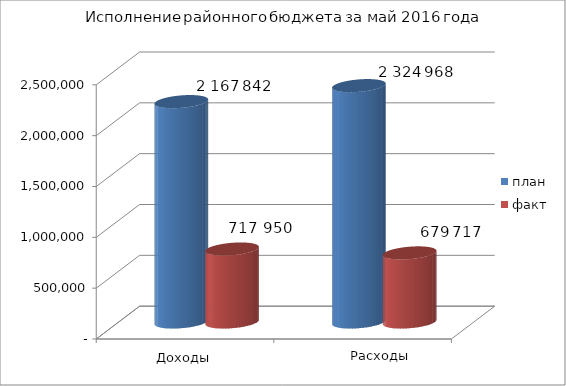
| Category | план | факт |
|---|---|---|
| 0 | 2167842 | 717950 |
| 1 | 2324968 | 679717 |